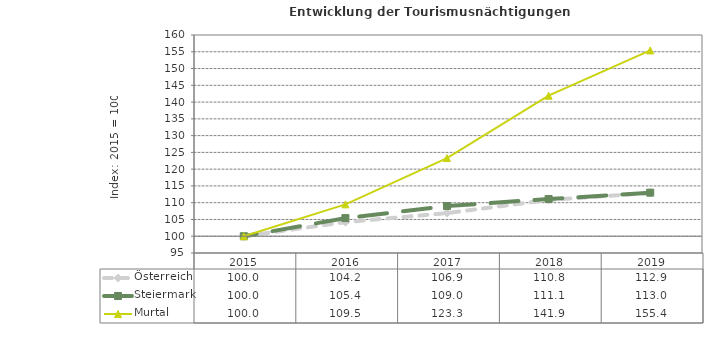
| Category | Österreich | Steiermark | Murtal |
|---|---|---|---|
| 2019.0 | 112.9 | 113 | 155.4 |
| 2018.0 | 110.8 | 111.1 | 141.9 |
| 2017.0 | 106.9 | 109 | 123.3 |
| 2016.0 | 104.2 | 105.4 | 109.5 |
| 2015.0 | 100 | 100 | 100 |